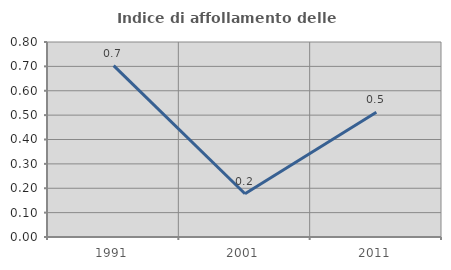
| Category | Indice di affollamento delle abitazioni  |
|---|---|
| 1991.0 | 0.703 |
| 2001.0 | 0.178 |
| 2011.0 | 0.512 |